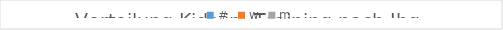
| Category | # | w | m |
|---|---|---|---|
| 2002.0 | 9 | 4 | 5 |